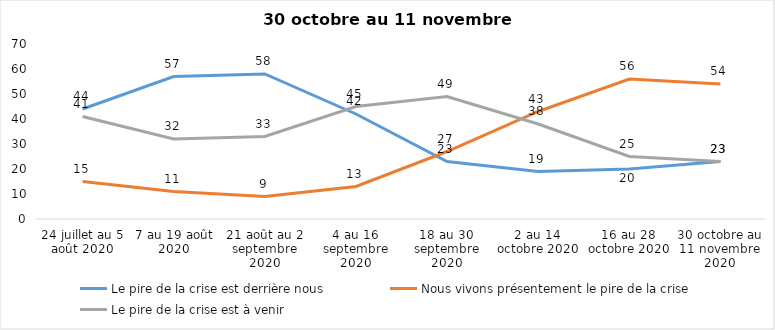
| Category | Le pire de la crise est derrière nous | Nous vivons présentement le pire de la crise | Le pire de la crise est à venir |
|---|---|---|---|
| 24 juillet au 5 août 2020 | 44 | 15 | 41 |
| 7 au 19 août 2020 | 57 | 11 | 32 |
| 21 août au 2 septembre 2020 | 58 | 9 | 33 |
| 4 au 16 septembre 2020 | 42 | 13 | 45 |
| 18 au 30 septembre 2020 | 23 | 27 | 49 |
| 2 au 14 octobre 2020 | 19 | 43 | 38 |
| 16 au 28 octobre 2020 | 20 | 56 | 25 |
| 30 octobre au 11 novembre 2020 | 23 | 54 | 23 |